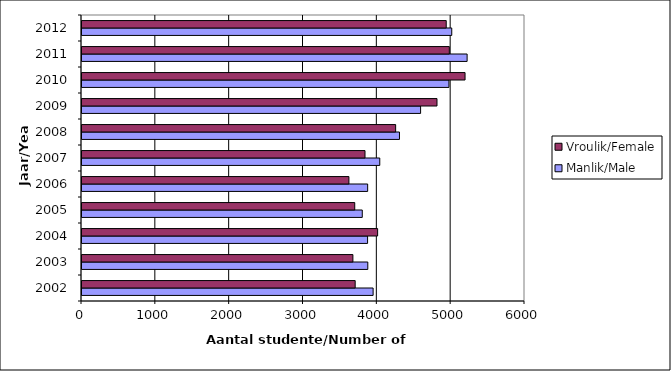
| Category | Manlik/Male | Vroulik/Female |
|---|---|---|
| 2002.0 | 3943 | 3700 |
| 2003.0 | 3871 | 3669 |
| 2004.0 | 3868 | 4004 |
| 2005.0 | 3796 | 3694 |
| 2006.0 | 3869 | 3615 |
| 2007.0 | 4033 | 3833 |
| 2008.0 | 4300 | 4248 |
| 2009.0 | 4586 | 4808 |
| 2010.0 | 4970 | 5188 |
| 2011.0 | 5216 | 4975 |
| 2012.0 | 5008 | 4933 |